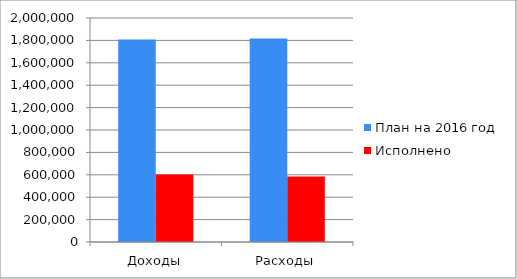
| Category | План на 2016 год | Исполнено  |
|---|---|---|
| Доходы | 1809078 | 603528 |
| Расходы | 1816333 | 584320 |